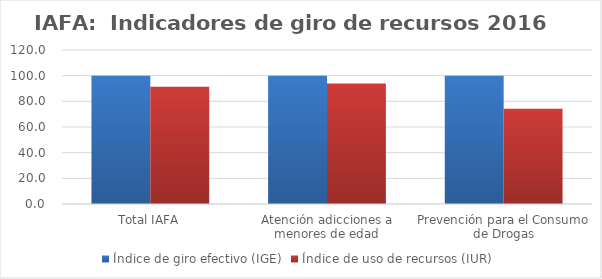
| Category | Índice de giro efectivo (IGE) | Índice de uso de recursos (IUR)  |
|---|---|---|
| Total IAFA | 100 | 91.28 |
| Atención adicciones a menores de edad | 100 | 93.907 |
| Prevención para el Consumo de Drogas | 100 | 74.264 |